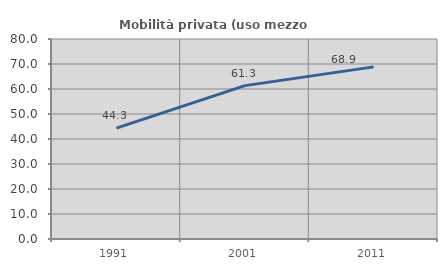
| Category | Mobilità privata (uso mezzo privato) |
|---|---|
| 1991.0 | 44.34 |
| 2001.0 | 61.35 |
| 2011.0 | 68.852 |